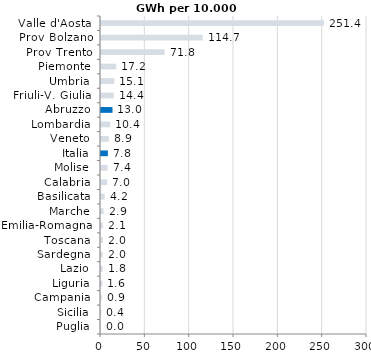
| Category | Series 0 |
|---|---|
| Puglia | 0.02 |
| Sicilia | 0.389 |
| Campania | 0.946 |
| Liguria | 1.603 |
| Lazio | 1.821 |
| Sardegna | 1.958 |
| Toscana | 2.017 |
| Emilia-Romagna | 2.111 |
| Marche | 2.872 |
| Basilicata | 4.166 |
| Calabria | 6.965 |
| Molise | 7.397 |
| Italia | 7.766 |
| Veneto | 8.892 |
| Lombardia | 10.379 |
| Abruzzo | 12.954 |
| Friuli-V. Giulia | 14.418 |
| Umbria | 15.07 |
| Piemonte | 17.248 |
| Prov Trento | 71.784 |
| Prov Bolzano | 114.715 |
| Valle d'Aosta | 251.428 |